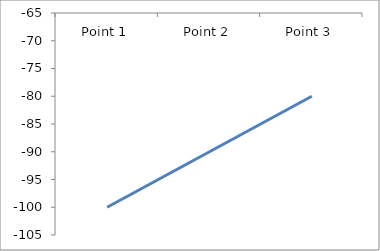
| Category | Series 5 |
|---|---|
| Point 1 | -100 |
| Point 2 | -90 |
| Point 3 | -80 |